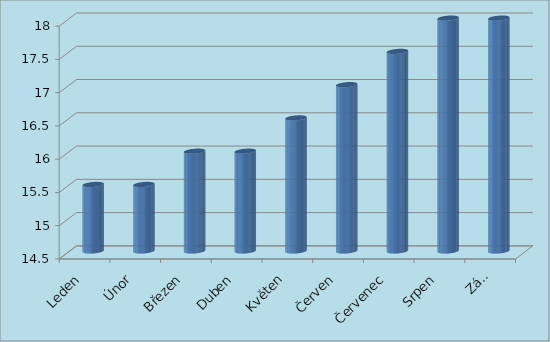
| Category | Cena za kus |
|---|---|
| Leden | 15.5 |
| Únor | 15.5 |
| Březen | 16 |
| Duben | 16 |
| Květen | 16.5 |
| Červen | 17 |
| Červenec | 17.5 |
| Srpen | 18 |
| Září | 18 |